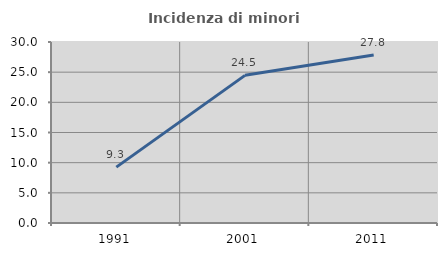
| Category | Incidenza di minori stranieri |
|---|---|
| 1991.0 | 9.259 |
| 2001.0 | 24.473 |
| 2011.0 | 27.846 |